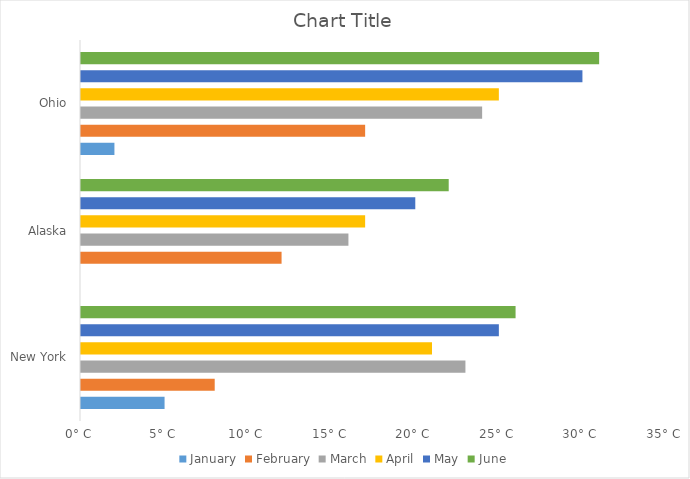
| Category | January | February | March | April | May | June |
|---|---|---|---|---|---|---|
| New York | 5 | 8 | 23 | 21 | 25 | 26 |
| Alaska | 0 | 12 | 16 | 17 | 20 | 22 |
| Ohio | 2 | 17 | 24 | 25 | 30 | 31 |